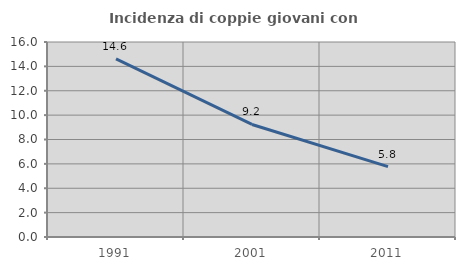
| Category | Incidenza di coppie giovani con figli |
|---|---|
| 1991.0 | 14.613 |
| 2001.0 | 9.234 |
| 2011.0 | 5.78 |